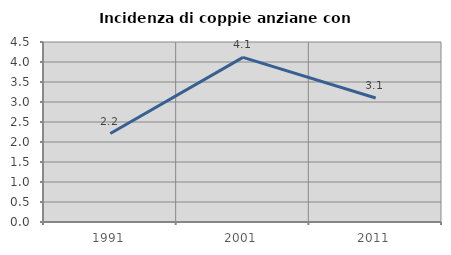
| Category | Incidenza di coppie anziane con figli |
|---|---|
| 1991.0 | 2.212 |
| 2001.0 | 4.116 |
| 2011.0 | 3.099 |